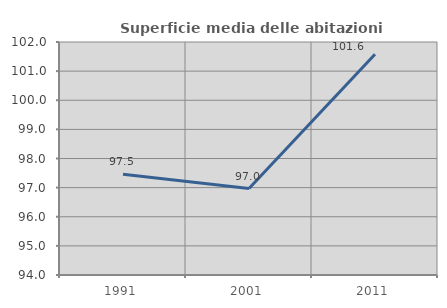
| Category | Superficie media delle abitazioni occupate |
|---|---|
| 1991.0 | 97.458 |
| 2001.0 | 96.969 |
| 2011.0 | 101.581 |